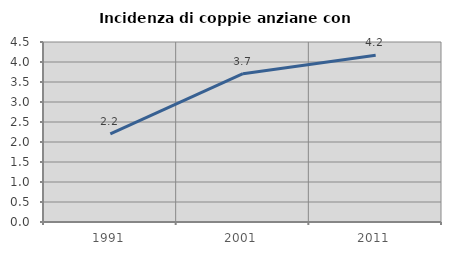
| Category | Incidenza di coppie anziane con figli |
|---|---|
| 1991.0 | 2.203 |
| 2001.0 | 3.708 |
| 2011.0 | 4.171 |